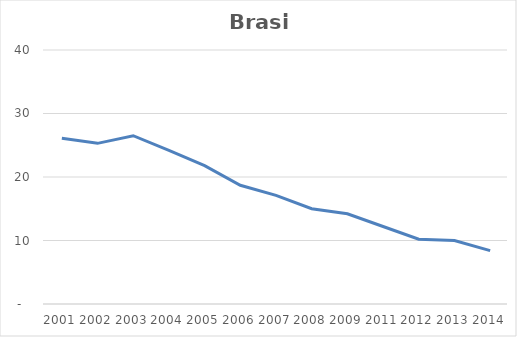
| Category | Total |
|---|---|
| 2001.0 | 26.1 |
| 2002.0 | 25.3 |
| 2003.0 | 26.5 |
| 2004.0 | 24.2 |
| 2005.0 | 21.8 |
| 2006.0 | 18.7 |
| 2007.0 | 17.1 |
| 2008.0 | 15 |
| 2009.0 | 14.2 |
| 2011.0 | 12.2 |
| 2012.0 | 10.2 |
| 2013.0 | 10 |
| 2014.0 | 8.4 |